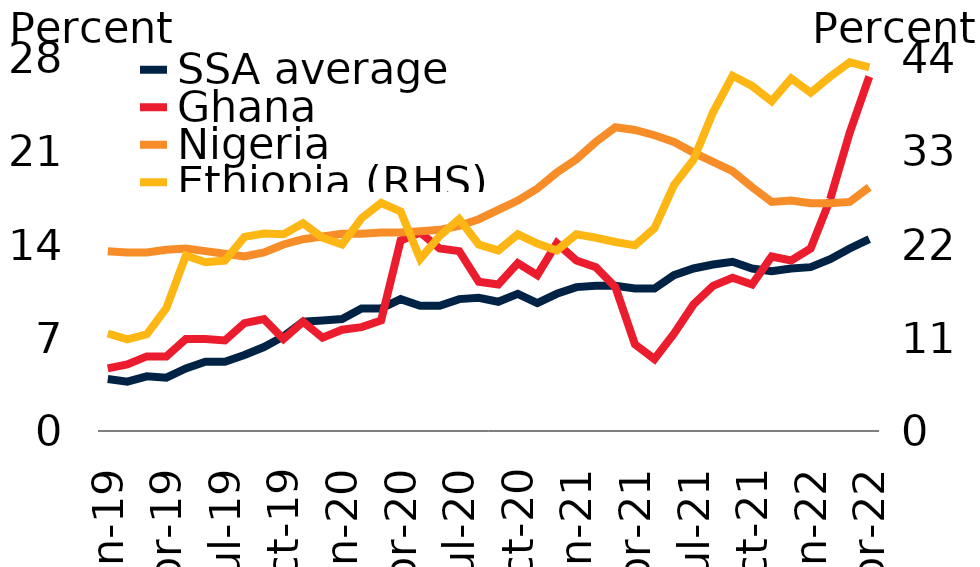
| Category | SSA average | Ghana | Nigeria |
|---|---|---|---|
| 2019-01-01 | 3.9 | 4.7 | 13.5 |
| 2019-02-01 | 3.7 | 5 | 13.4 |
| 2019-03-01 | 4.1 | 5.6 | 13.4 |
| 2019-04-01 | 4 | 5.6 | 13.6 |
| 2019-05-01 | 4.7 | 6.9 | 13.7 |
| 2019-06-01 | 5.2 | 6.9 | 13.5 |
| 2019-07-01 | 5.2 | 6.8 | 13.3 |
| 2019-08-01 | 5.7 | 8.1 | 13.1 |
| 2019-09-01 | 6.3 | 8.4 | 13.4 |
| 2019-10-01 | 7.1 | 6.9 | 14 |
| 2019-11-01 | 8.2 | 8.2 | 14.4 |
| 2019-12-01 | 8.3 | 7 | 14.6 |
| 2020-01-01 | 8.4 | 7.6 | 14.8 |
| 2020-02-01 | 9.2 | 7.8 | 14.8 |
| 2020-03-01 | 9.2 | 8.3 | 14.9 |
| 2020-04-01 | 9.9 | 14.3 | 14.9 |
| 2020-05-01 | 9.4 | 14.9 | 15 |
| 2020-06-01 | 9.4 | 13.7 | 15.1 |
| 2020-07-01 | 9.9 | 13.5 | 15.4 |
| 2020-08-01 | 10 | 11.2 | 15.9 |
| 2020-09-01 | 9.7 | 11 | 16.6 |
| 2020-10-01 | 10.3 | 12.6 | 17.3 |
| 2020-11-01 | 9.6 | 11.7 | 18.2 |
| 2020-12-01 | 10.3 | 14.1 | 19.4 |
| 2021-01-01 | 10.8 | 12.8 | 20.4 |
| 2021-02-01 | 10.9 | 12.3 | 21.7 |
| 2021-03-01 | 10.9 | 10.8 | 22.8 |
| 2021-04-01 | 10.7 | 6.5 | 22.6 |
| 2021-05-01 | 10.7 | 5.4 | 22.2 |
| 2021-06-01 | 11.7 | 7.3 | 21.7 |
| 2021-07-01 | 12.2 | 9.5 | 20.9 |
| 2021-08-01 | 12.5 | 10.9 | 20.2 |
| 2021-09-01 | 12.7 | 11.5 | 19.5 |
| 2021-10-01 | 12.2 | 11 | 18.3 |
| 2021-11-01 | 12 | 13.1 | 17.2 |
| 2021-12-01 | 12.2 | 12.8 | 17.3 |
| 2022-01-01 | 12.3 | 13.7 | 17.1 |
| 2022-02-01 | 12.9 | 17.4 | 17.1 |
| 2022-03-01 | 13.7 | 22.4 | 17.2 |
| 2022-04-01 | 14.4 | 26.6 | 18.3 |